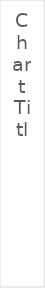
| Category | Series 0 | Series 1 |
|---|---|---|
| 0 | 3098.676 |  |
| 1 | 3025.138 |  |
| 2 | 2936.246 |  |
| 3 | 2964.652 |  |
| 4 | 3076.104 |  |
| 5 | 3287.576 |  |
| 6 | 3444.534 |  |
| 7 | 3608.376 |  |
| 8 | 3800.206 |  |
| 9 | 4034.472 |  |
| 10 | 4290.304 |  |
| 11 | 4527.29 |  |
| 12 | 4788.094 |  |
| 13 | 4964.922 |  |
| 14 | 5106.22 |  |
| 15 | 5162.534 |  |
| 16 | 5103.092 |  |
| 17 | 4912.368 |  |
| 18 | 4695.994 |  |
| 19 | 4831.862 |  |
| 20 | 4558.684 |  |
| 21 | 4014.082 |  |
| 22 | 3581.188 |  |
| 23 | 3346.162 |  |
| 24 | 3215.89 |  |
| 25 | 3124.08 |  |
| 26 | 3058.496 |  |
| 27 | 3060.634 |  |
| 28 | 3173.968 |  |
| 29 | 3378.614 |  |
| 30 | 3569.434 |  |
| 31 | 3758.97 |  |
| 32 | 4008.986 |  |
| 33 | 4282.16 |  |
| 34 | 4506.308 |  |
| 35 | 4690.484 |  |
| 36 | 4834.956 |  |
| 37 | 5019.992 |  |
| 38 | 5114.254 |  |
| 39 | 5198.582 |  |
| 40 | 5094.38 |  |
| 41 | 4906.818 |  |
| 42 | 4707.02 |  |
| 43 | 4821.77 |  |
| 44 | 4524.242 |  |
| 45 | 4115.152 |  |
| 46 | 3663.418 |  |
| 47 | 3469.59 |  |